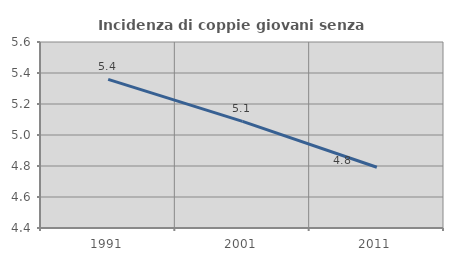
| Category | Incidenza di coppie giovani senza figli |
|---|---|
| 1991.0 | 5.359 |
| 2001.0 | 5.088 |
| 2011.0 | 4.792 |